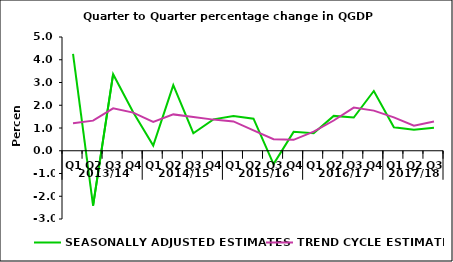
| Category | SEASONALLY ADJUSTED ESTIMATES | TREND CYCLE ESTIMATES |
|---|---|---|
| 0 | 4.255 | 1.206 |
| 1 | -2.415 | 1.325 |
| 2 | 3.365 | 1.862 |
| 3 | 1.689 | 1.675 |
| 4 | 0.226 | 1.269 |
| 5 | 2.882 | 1.598 |
| 6 | 0.771 | 1.483 |
| 7 | 1.38 | 1.368 |
| 8 | 1.528 | 1.291 |
| 9 | 1.409 | 0.896 |
| 10 | -0.586 | 0.505 |
| 11 | 0.83 | 0.48 |
| 12 | 0.773 | 0.838 |
| 13 | 1.532 | 1.33 |
| 14 | 1.461 | 1.898 |
| 15 | 2.628 | 1.765 |
| 16 | 1.031 | 1.465 |
| 17 | 0.928 | 1.104 |
| 18 | 1.011 | 1.287 |